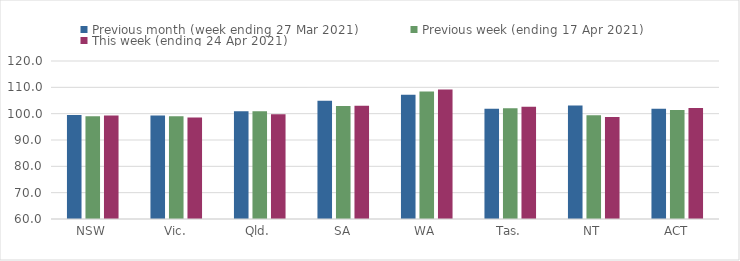
| Category | Previous month (week ending 27 Mar 2021) | Previous week (ending 17 Apr 2021) | This week (ending 24 Apr 2021) |
|---|---|---|---|
| NSW | 99.5 | 98.98 | 99.31 |
| Vic. | 99.26 | 99.02 | 98.53 |
| Qld. | 100.89 | 100.88 | 99.79 |
| SA | 104.92 | 102.87 | 103.02 |
| WA | 107.15 | 108.38 | 109.13 |
| Tas. | 101.88 | 102.08 | 102.6 |
| NT | 103.08 | 99.39 | 98.69 |
| ACT | 101.82 | 101.43 | 102.17 |